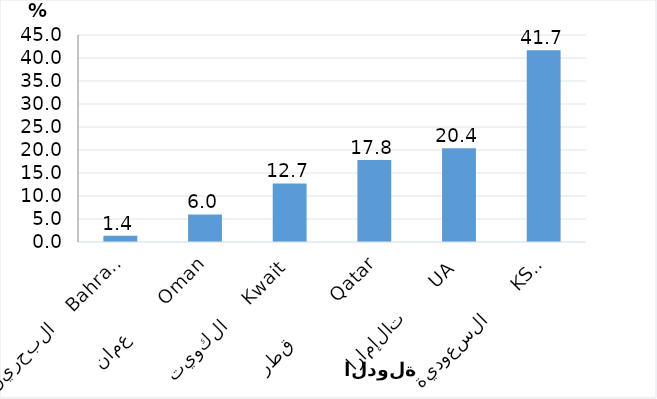
| Category | Series 0 |
|---|---|
| السعودية       KSA      | 41.678 |
| الإمارات       UAE | 20.386 |
| قطر          Qatar | 17.839 |
| الكويت     Kwait | 12.735 |
| عمان        Oman | 5.984 |
| البحرين    Bahrain | 1.378 |